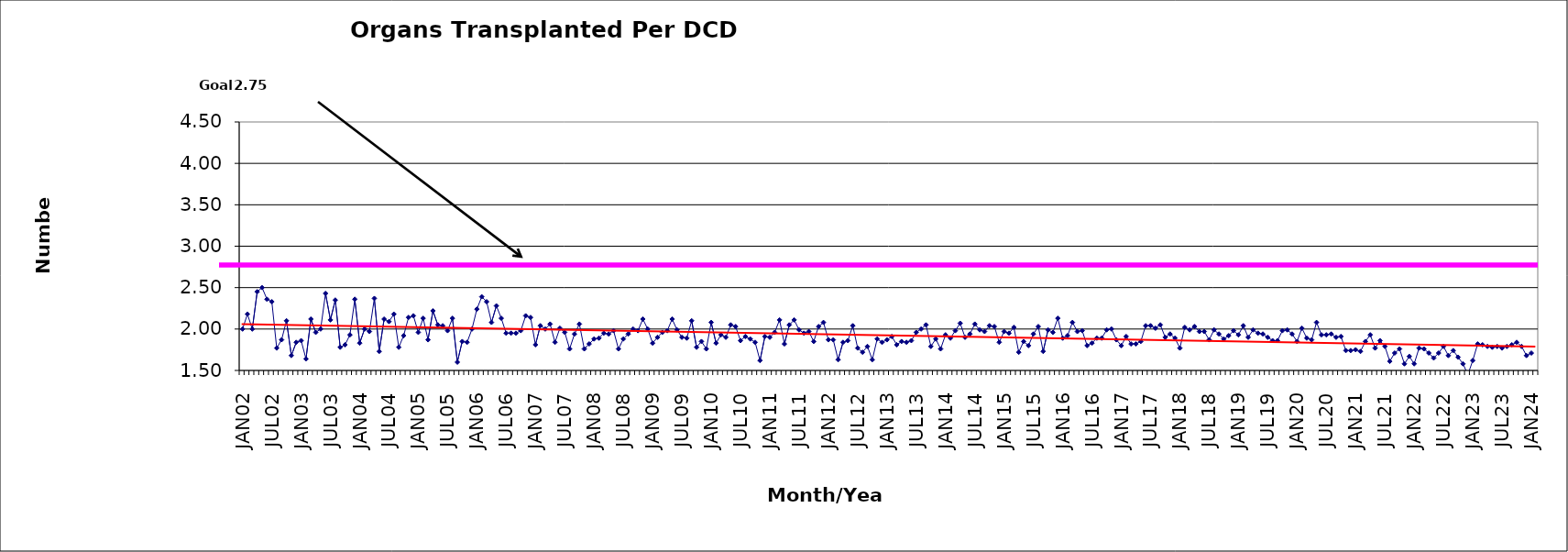
| Category | Series 0 |
|---|---|
| JAN02 | 2 |
| FEB02 | 2.18 |
| MAR02 | 2 |
| APR02 | 2.45 |
| MAY02 | 2.5 |
| JUN02 | 2.36 |
| JUL02 | 2.33 |
| AUG02 | 1.77 |
| SEP02 | 1.87 |
| OCT02 | 2.1 |
| NOV02 | 1.68 |
| DEC02 | 1.84 |
| JAN03 | 1.86 |
| FEB03 | 1.64 |
| MAR03 | 2.12 |
| APR03 | 1.96 |
| MAY03 | 2 |
| JUN03 | 2.43 |
| JUL03 | 2.11 |
| AUG03 | 2.35 |
| SEP03 | 1.78 |
| OCT03 | 1.81 |
| NOV03 | 1.93 |
| DEC03 | 2.36 |
| JAN04 | 1.83 |
| FEB04 | 2 |
| MAR04 | 1.97 |
| APR04 | 2.37 |
| MAY04 | 1.73 |
| JUN04 | 2.12 |
| JUL04 | 2.09 |
| AUG04 | 2.18 |
| SEP04 | 1.78 |
| OCT04 | 1.92 |
| NOV04 | 2.14 |
| DEC04 | 2.16 |
| JAN05 | 1.96 |
| FEB05 | 2.13 |
| MAR05 | 1.87 |
| APR05 | 2.22 |
| MAY05 | 2.05 |
| JUN05 | 2.04 |
| JUL05 | 1.98 |
| AUG05 | 2.13 |
| SEP05 | 1.6 |
| OCT05 | 1.85 |
| NOV05 | 1.84 |
| DEC05 | 2 |
| JAN06 | 2.24 |
| FEB06 | 2.39 |
| MAR06 | 2.33 |
| APR06 | 2.08 |
| MAY06 | 2.28 |
| JUN06 | 2.13 |
| JUL06 | 1.95 |
| AUG06 | 1.95 |
| SEP06 | 1.95 |
| OCT06 | 1.98 |
| NOV06 | 2.16 |
| DEC06 | 2.14 |
| JAN07 | 1.81 |
| FEB07 | 2.04 |
| MAR07 | 2 |
| APR07 | 2.06 |
| MAY07 | 1.84 |
| JUN07 | 2.01 |
| JUL07 | 1.96 |
| AUG07 | 1.76 |
| SEP07 | 1.94 |
| OCT07 | 2.06 |
| NOV07 | 1.76 |
| DEC07 | 1.82 |
| JAN08 | 1.88 |
| FEB08 | 1.89 |
| MAR08 | 1.95 |
| APR08 | 1.94 |
| MAY08 | 1.98 |
| JUN08 | 1.76 |
| JUL08 | 1.88 |
| AUG08 | 1.94 |
| SEP08 | 2 |
| OCT08 | 1.98 |
| NOV08 | 2.12 |
| DEC08 | 2 |
| JAN09 | 1.83 |
| FEB09 | 1.9 |
| MAR09 | 1.96 |
| APR09 | 1.98 |
| MAY09 | 2.12 |
| JUN09 | 1.99 |
| JUL09 | 1.9 |
| AUG09 | 1.89 |
| SEP09 | 2.1 |
| OCT09 | 1.78 |
| NOV09 | 1.85 |
| DEC09 | 1.76 |
| JAN10 | 2.08 |
| FEB10 | 1.83 |
| MAR10 | 1.93 |
| APR10 | 1.9 |
| MAY10 | 2.05 |
| JUN10 | 2.03 |
| JUL10 | 1.86 |
| AUG10 | 1.91 |
| SEP10 | 1.88 |
| OCT10 | 1.84 |
| NOV10 | 1.62 |
| DEC10 | 1.91 |
| JAN11 | 1.9 |
| FEB11 | 1.96 |
| MAR11 | 2.11 |
| APR11 | 1.82 |
| MAY11 | 2.05 |
| JUN11 | 2.11 |
| JUL11 | 1.99 |
| AUG11 | 1.95 |
| SEP11 | 1.97 |
| OCT11 | 1.85 |
| NOV11 | 2.03 |
| DEC11 | 2.08 |
| JAN12 | 1.87 |
| FEB12 | 1.87 |
| MAR12 | 1.63 |
| APR12 | 1.84 |
| MAY12 | 1.86 |
| JUN12 | 2.04 |
| JUL12 | 1.77 |
| AUG12 | 1.72 |
| SEP12 | 1.79 |
| OCT12 | 1.63 |
| NOV12 | 1.88 |
| DEC12 | 1.84 |
| JAN13 | 1.87 |
| FEB13 | 1.91 |
| MAR13 | 1.81 |
| APR13 | 1.85 |
| MAY13 | 1.84 |
| JUN13 | 1.86 |
| JUL13 | 1.96 |
| AUG13 | 2 |
| SEP13 | 2.05 |
| OCT13 | 1.79 |
| NOV13 | 1.88 |
| DEC13 | 1.76 |
| JAN14 | 1.93 |
| FEB14 | 1.89 |
| MAR14 | 1.98 |
| APR14 | 2.07 |
| MAY14 | 1.9 |
| JUN14 | 1.94 |
| JUL14 | 2.06 |
| AUG14 | 1.99 |
| SEP14 | 1.97 |
| OCT14 | 2.04 |
| NOV14 | 2.03 |
| DEC14 | 1.84 |
| JAN15 | 1.97 |
| FEB15 | 1.95 |
| MAR15 | 2.02 |
| APR15 | 1.72 |
| MAY15 | 1.85 |
| JUN15 | 1.8 |
| JUL15 | 1.94 |
| AUG15 | 2.03 |
| SEP15 | 1.73 |
| OCT15 | 1.99 |
| NOV15 | 1.96 |
| DEC15 | 2.13 |
| JAN16 | 1.89 |
| FEB16 | 1.92 |
| MAR16 | 2.08 |
| APR16 | 1.97 |
| MAY16 | 1.98 |
| JUN16 | 1.8 |
| JUL16 | 1.83 |
| AUG16 | 1.89 |
| SEP16 | 1.89 |
| OCT16 | 1.99 |
| NOV16 | 2 |
| DEC16 | 1.87 |
| JAN17 | 1.8 |
| FEB17 | 1.91 |
| MAR17 | 1.82 |
| APR17 | 1.82 |
| MAY17 | 1.85 |
| JUN17 | 2.04 |
| JUL17 | 2.04 |
| AUG17 | 2.01 |
| SEP17 | 2.05 |
| OCT17 | 1.9 |
| NOV17 | 1.94 |
| DEC17 | 1.89 |
| JAN18 | 1.77 |
| FEB18 | 2.02 |
| MAR18 | 1.99 |
| APR18 | 2.03 |
| MAY18 | 1.97 |
| JUN18 | 1.97 |
| JUL18 | 1.87 |
| AUG18 | 1.99 |
| SEP18 | 1.94 |
| OCT18 | 1.88 |
| NOV18 | 1.92 |
| DEC18 | 1.98 |
| JAN19 | 1.93 |
| FEB19 | 2.04 |
| MAR19 | 1.9 |
| APR19 | 1.99 |
| MAY19 | 1.95 |
| JUN19 | 1.94 |
| JUL19 | 1.9 |
| AUG19 | 1.86 |
| SEP19 | 1.86 |
| OCT19 | 1.98 |
| NOV19 | 1.99 |
| DEC19 | 1.94 |
| JAN20 | 1.85 |
| FEB20 | 2.01 |
| MAR20 | 1.89 |
| APR20 | 1.87 |
| MAY20 | 2.08 |
| JUN20 | 1.93 |
| JUL20 | 1.93 |
| AUG20 | 1.94 |
| SEP20 | 1.9 |
| OCT20 | 1.91 |
| NOV20 | 1.74 |
| DEC20 | 1.74 |
| JAN21 | 1.75 |
| FEB21 | 1.73 |
| MAR21 | 1.85 |
| APR21 | 1.93 |
| MAY21 | 1.77 |
| JUN21 | 1.86 |
| JUL21 | 1.79 |
| AUG21 | 1.61 |
| SEP21 | 1.71 |
| OCT21 | 1.76 |
| NOV21 | 1.58 |
| DEC21 | 1.67 |
| JAN22 | 1.58 |
| FEB22 | 1.77 |
| MAR22 | 1.76 |
| APR22 | 1.71 |
| MAY22 | 1.65 |
| JUN22 | 1.71 |
| JUL22 | 1.79 |
| AUG22 | 1.68 |
| SEP22 | 1.74 |
| OCT22 | 1.66 |
| NOV22 | 1.58 |
| DEC22 | 1.45 |
| JAN23 | 1.62 |
| FEB23 | 1.82 |
| MAR23 | 1.81 |
| APR23 | 1.79 |
| MAY23 | 1.78 |
| JUN23 | 1.79 |
| JUL23 | 1.77 |
| AUG23 | 1.79 |
| SEP23 | 1.81 |
| OCT23 | 1.84 |
| NOV23 | 1.79 |
| DEC23 | 1.68 |
| JAN24 | 1.71 |